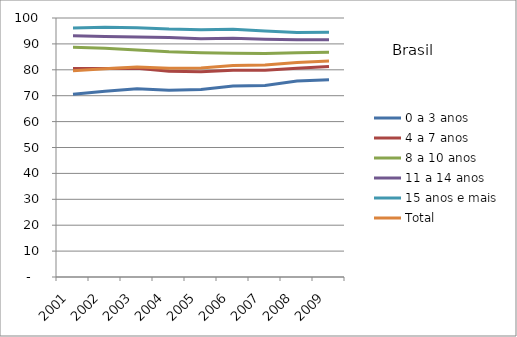
| Category | 0 a 3 anos | 4 a 7 anos | 8 a 10 anos | 11 a 14 anos | 15 anos e mais | Total |
|---|---|---|---|---|---|---|
| 2001 | 70.55 | 80.49 | 88.73 | 93.12 | 96.18 | 79.66 |
| 2002 | 71.7 | 80.48 | 88.36 | 92.88 | 96.39 | 80.42 |
| 2003 | 72.7 | 80.57 | 87.68 | 92.67 | 96.28 | 81.05 |
| 2004 | 72.15 | 79.44 | 87 | 92.5 | 95.75 | 80.56 |
| 2005 | 72.39 | 79.23 | 86.63 | 92.02 | 95.5 | 80.69 |
| 2006 | 73.75 | 79.85 | 86.43 | 92.18 | 95.62 | 81.69 |
| 2007 | 73.95 | 79.82 | 86.27 | 91.82 | 95.01 | 81.83 |
| 2008 | 75.63 | 80.57 | 86.55 | 91.64 | 94.38 | 82.84 |
| 2009 | 76.13 | 81.28 | 86.74 | 91.56 | 94.53 | 83.37 |